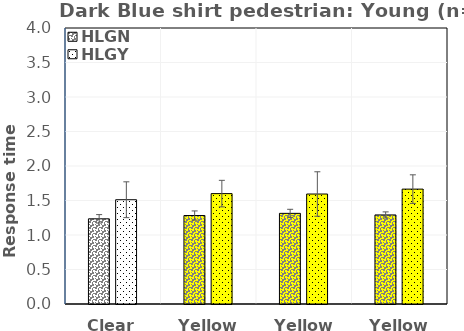
| Category | HLGN | HLGY |
|---|---|---|
| Clear | 1.234 | 1.511 |
| Yellow1 | 1.282 | 1.6 |
| Yellow2 | 1.314 | 1.594 |
| Yellow3 | 1.291 | 1.665 |